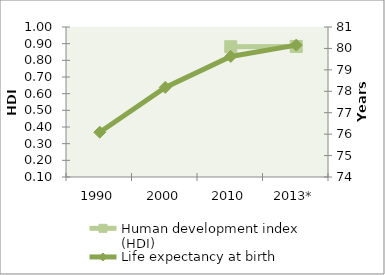
| Category | Human development index (HDI) |
|---|---|
| 1990 | 0 |
| 2000 | 0 |
| 2010 | 0.882 |
| 2013* | 0.883 |